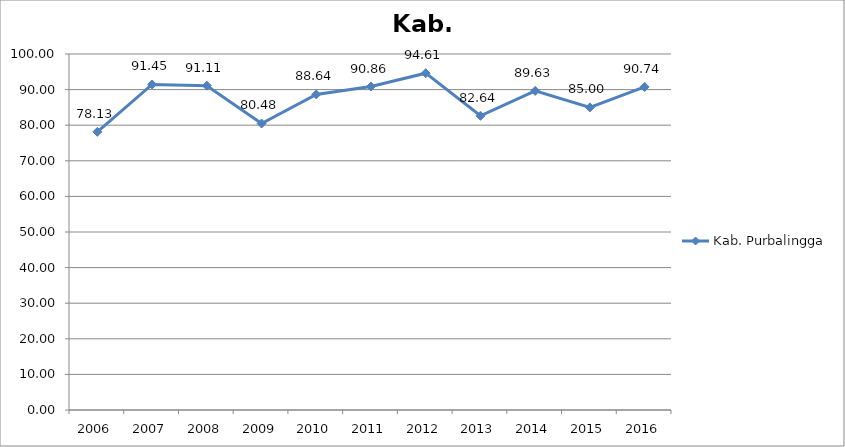
| Category | Kab. Purbalingga |
|---|---|
| 2006.0 | 78.13 |
| 2007.0 | 91.45 |
| 2008.0 | 91.11 |
| 2009.0 | 80.48 |
| 2010.0 | 88.64 |
| 2011.0 | 90.86 |
| 2012.0 | 94.61 |
| 2013.0 | 82.64 |
| 2014.0 | 89.63 |
| 2015.0 | 85 |
| 2016.0 | 90.74 |